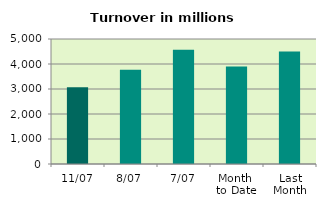
| Category | Series 0 |
|---|---|
| 11/07 | 3067.014 |
| 8/07 | 3767.994 |
| 7/07 | 4567.309 |
| Month 
to Date | 3897.444 |
| Last
Month | 4502.251 |